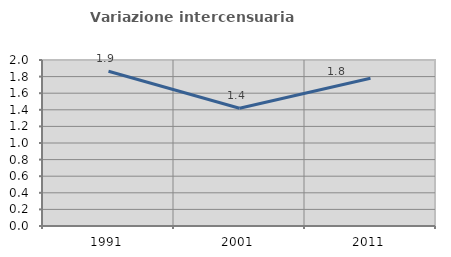
| Category | Variazione intercensuaria annua |
|---|---|
| 1991.0 | 1.865 |
| 2001.0 | 1.419 |
| 2011.0 | 1.781 |